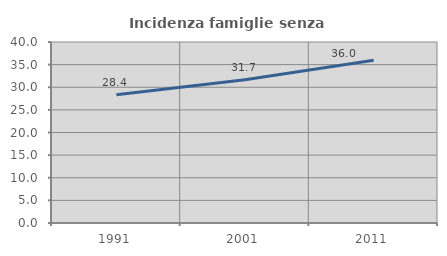
| Category | Incidenza famiglie senza nuclei |
|---|---|
| 1991.0 | 28.367 |
| 2001.0 | 31.651 |
| 2011.0 | 35.953 |